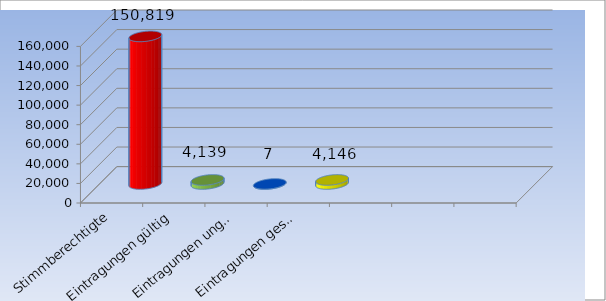
| Category | Series 0 | Series 1 |
|---|---|---|
| Stimmberechtigte |  | 150819 |
| Eintragungen gültig |  | 4139 |
| Eintragungen ungültig |  | 7 |
| Eintragungen gesamt |  | 4146 |